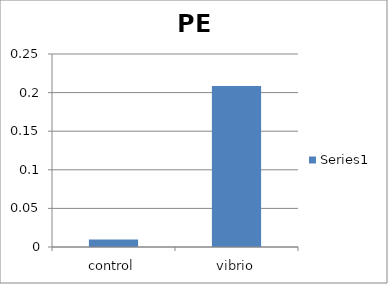
| Category | Series 0 |
|---|---|
| control | 0.01 |
| vibrio | 0.208 |